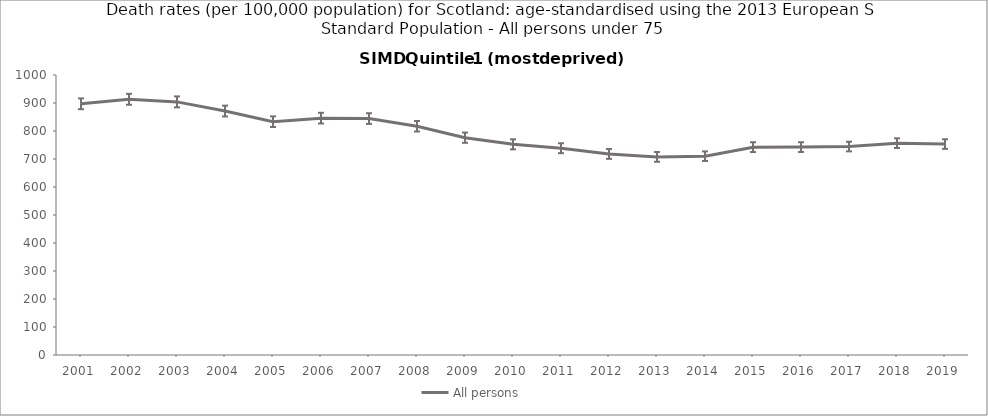
| Category | All persons |
|---|---|
| 2001.0 | 897.2 |
| 2002.0 | 913.2 |
| 2003.0 | 904 |
| 2004.0 | 871.2 |
| 2005.0 | 833.3 |
| 2006.0 | 845.9 |
| 2007.0 | 844.4 |
| 2008.0 | 817 |
| 2009.0 | 776.1 |
| 2010.0 | 752.4 |
| 2011.0 | 738.5 |
| 2012.0 | 718.2 |
| 2013.0 | 707.5 |
| 2014.0 | 710.1 |
| 2015.0 | 742.3 |
| 2016.0 | 742.5 |
| 2017.0 | 744.5 |
| 2018.0 | 756.6 |
| 2019.0 | 753.4 |